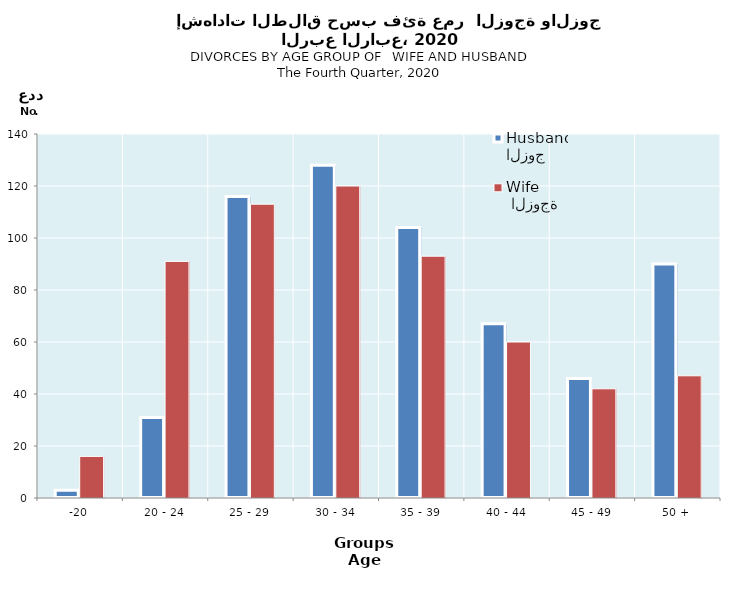
| Category | الزوج
Husband |  الزوجة
Wife |
|---|---|---|
| -20 | 3 | 16 |
| 20 - 24 | 31 | 91 |
| 25 - 29 | 116 | 113 |
| 30 - 34 | 128 | 120 |
| 35 - 39 | 104 | 93 |
| 40 - 44 | 67 | 60 |
| 45 - 49 | 46 | 42 |
| 50 + | 90 | 47 |